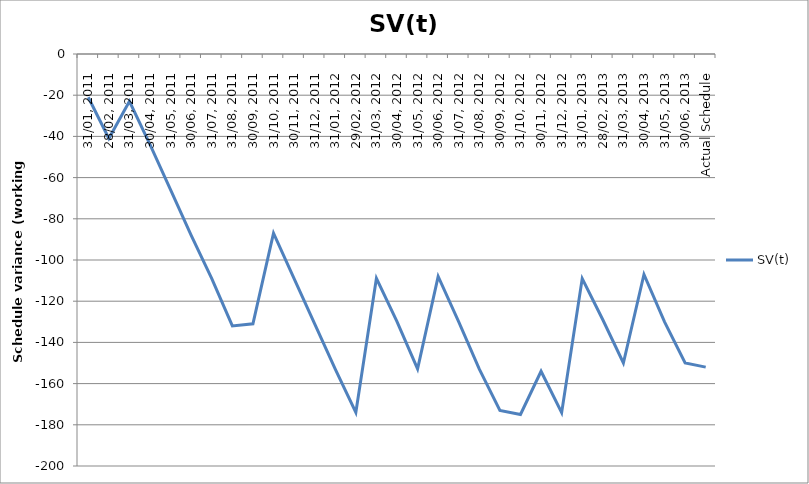
| Category | SV(t) |
|---|---|
| 31/01, 2011 | -21 |
| 28/02, 2011 | -41 |
| 31/03, 2011 | -23 |
| 30/04, 2011 | -44 |
| 31/05, 2011 | -66 |
| 30/06, 2011 | -88 |
| 31/07, 2011 | -109 |
| 31/08, 2011 | -132 |
| 30/09, 2011 | -131 |
| 31/10, 2011 | -87 |
| 30/11, 2011 | -109 |
| 31/12, 2011 | -131 |
| 31/01, 2012 | -153 |
| 29/02, 2012 | -174 |
| 31/03, 2012 | -108.875 |
| 30/04, 2012 | -129.875 |
| 31/05, 2012 | -152.875 |
| 30/06, 2012 | -108 |
| 31/07, 2012 | -130 |
| 31/08, 2012 | -153 |
| 30/09, 2012 | -173 |
| 31/10, 2012 | -175 |
| 30/11, 2012 | -154 |
| 31/12, 2012 | -174.125 |
| 31/01, 2013 | -109 |
| 28/02, 2013 | -129 |
| 31/03, 2013 | -150 |
| 30/04, 2013 | -107 |
| 31/05, 2013 | -130 |
| 30/06, 2013 | -150 |
| Actual Schedule | -152 |